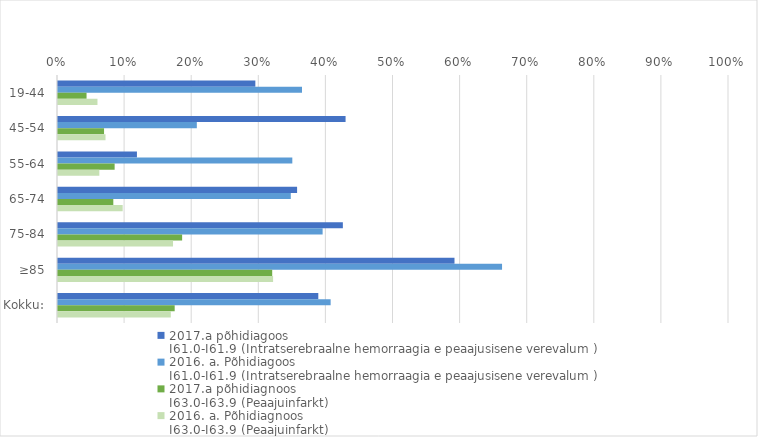
| Category | 2017.a põhidiagoos 
I61.0-I61.9 (Intratserebraalne hemorraagia e peaajusisene verevalum ) | 2016. a. Põhidiagoos 
I61.0-I61.9 (Intratserebraalne hemorraagia e peaajusisene verevalum ) | 2017.a põhidiagnoos
I63.0-I63.9 (Peaajuinfarkt) | 2016. a. Põhidiagnoos
I63.0-I63.9 (Peaajuinfarkt) |
|---|---|---|---|---|
| 19-44 | 0.294 | 0.364 | 0.043 | 0.059 |
| 45-54 | 0.429 | 0.207 | 0.069 | 0.071 |
| 55-64 | 0.118 | 0.349 | 0.084 | 0.062 |
| 65-74 | 0.356 | 0.347 | 0.082 | 0.096 |
| 75-84 | 0.425 | 0.394 | 0.185 | 0.171 |
| ≥85 | 0.591 | 0.662 | 0.319 | 0.321 |
| Kokku: | 0.388 | 0.406 | 0.174 | 0.168 |